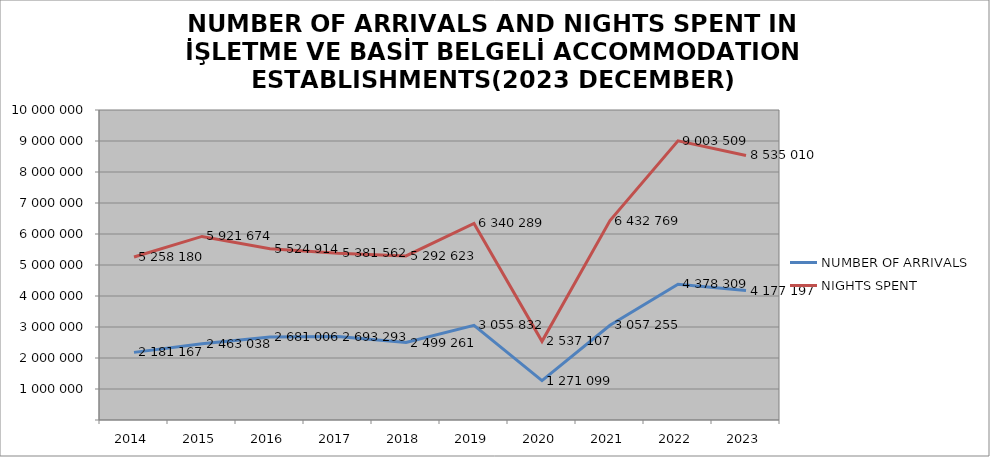
| Category | NUMBER OF ARRIVALS | NIGHTS SPENT |
|---|---|---|
| 2014 | 2181167 | 5258180 |
| 2015 | 2463038 | 5921674 |
| 2016 | 2681006 | 5524914 |
| 2017 | 2693293 | 5381562 |
| 2018 | 2499261 | 5292623 |
| 2019 | 3055832 | 6340289 |
| 2020 | 1271099 | 2537107 |
| 2021 | 3057255 | 6432769 |
| 2022 | 4378309 | 9003509 |
| 2023 | 4177197 | 8535010 |